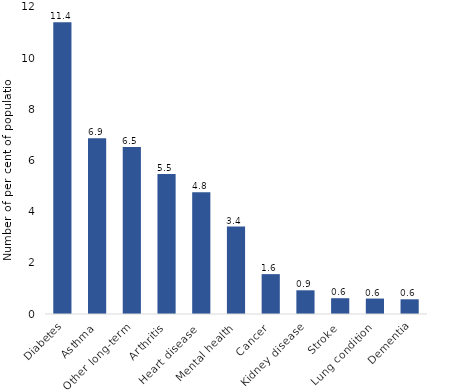
| Category | Series 0 |
|---|---|
| Diabetes | 11.404 |
| Asthma | 6.872 |
| Other long-term | 6.53 |
| Arthritis | 5.473 |
| Heart disease  | 4.764 |
| Mental health | 3.418 |
| Cancer | 1.558 |
| Kidney disease | 0.926 |
| Stroke | 0.617 |
| Lung condition | 0.603 |
| Dementia | 0.575 |